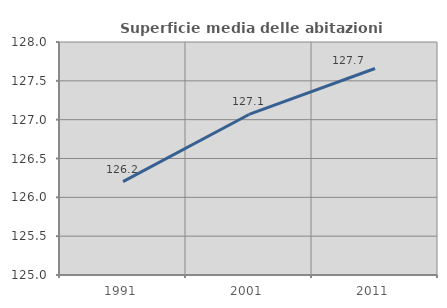
| Category | Superficie media delle abitazioni occupate |
|---|---|
| 1991.0 | 126.203 |
| 2001.0 | 127.067 |
| 2011.0 | 127.659 |